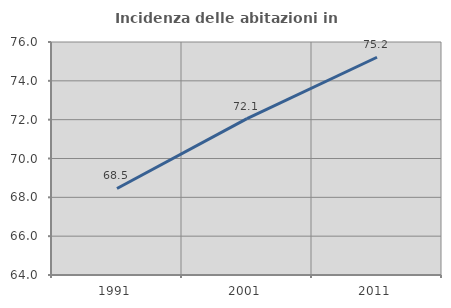
| Category | Incidenza delle abitazioni in proprietà  |
|---|---|
| 1991.0 | 68.456 |
| 2001.0 | 72.054 |
| 2011.0 | 75.215 |